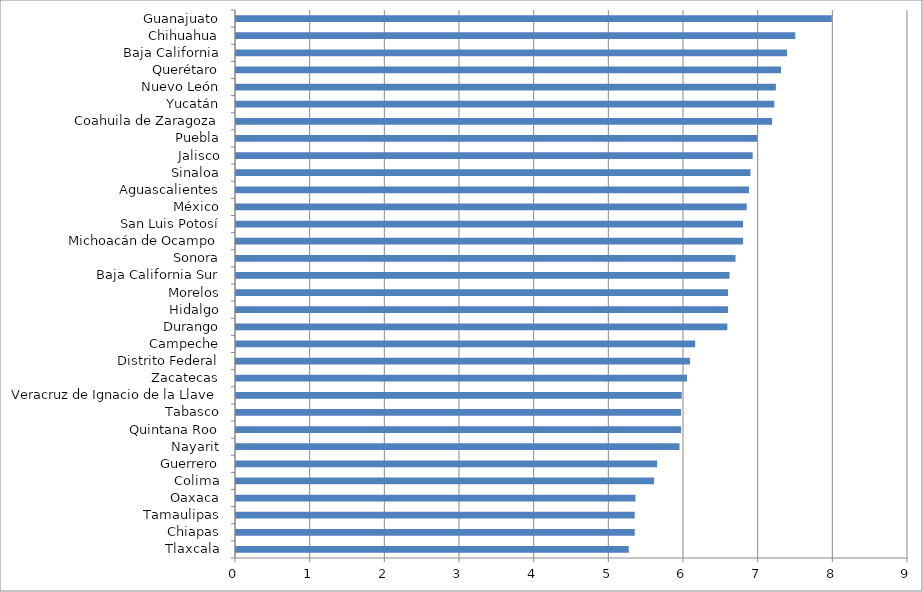
| Category | Series 0 |
|---|---|
| Tlaxcala | 5.26 |
| Chiapas | 5.34 |
| Tamaulipas | 5.34 |
| Oaxaca | 5.35 |
| Colima | 5.6 |
| Guerrero | 5.64 |
| Nayarit | 5.94 |
| Quintana Roo | 5.96 |
| Tabasco | 5.96 |
| Veracruz de Ignacio de la Llave | 5.97 |
| Zacatecas | 6.04 |
| Distrito Federal | 6.08 |
| Campeche | 6.15 |
| Durango | 6.58 |
| Hidalgo | 6.59 |
| Morelos | 6.59 |
| Baja California Sur | 6.61 |
| Sonora | 6.69 |
| Michoacán de Ocampo | 6.79 |
| San Luis Potosí | 6.79 |
| México | 6.84 |
| Aguascalientes | 6.87 |
| Sinaloa | 6.89 |
| Jalisco | 6.92 |
| Puebla | 6.98 |
| Coahuila de Zaragoza | 7.18 |
| Yucatán | 7.21 |
| Nuevo León | 7.23 |
| Querétaro | 7.3 |
| Baja California | 7.38 |
| Chihuahua | 7.49 |
| Guanajuato | 7.98 |